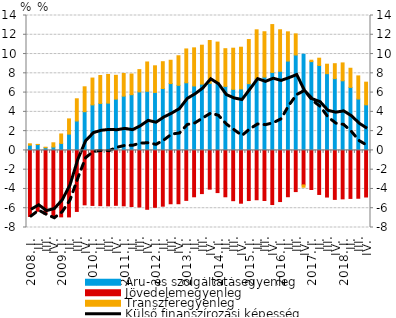
| Category | Áru- és szolgáltatásegyenleg | Jövedelemegyenleg | Transzferegyenleg |
|---|---|---|---|
| 2008. I. | 0.542 | -6.855 | 0.144 |
|          II. | 0.607 | -6.318 | 0.016 |
|          III. | 0.276 | -6.627 | 0.057 |
|          IV. | 0.356 | -6.874 | 0.434 |
| 2009. I. | 0.725 | -6.896 | 0.982 |
|          II. | 1.689 | -6.9 | 1.582 |
|          III. | 3.052 | -6.333 | 2.306 |
|          IV. | 4.018 | -5.649 | 2.584 |
| 2010. I. | 4.723 | -5.709 | 2.785 |
|          II. | 4.875 | -5.734 | 2.897 |
|          III. | 4.906 | -5.753 | 2.976 |
|          IV. | 5.323 | -5.696 | 2.468 |
| 2011. I. | 5.632 | -5.751 | 2.353 |
|          II. | 5.782 | -5.822 | 2.145 |
|          III. | 6.075 | -5.873 | 2.309 |
|          IV. | 6.133 | -6.11 | 3.044 |
| 2012. I. | 6.016 | -5.905 | 2.764 |
|          II. | 6.423 | -5.787 | 2.783 |
|          III. | 6.938 | -5.537 | 2.417 |
|          IV. | 6.753 | -5.533 | 3.069 |
| 2013. I. | 7.019 | -5.186 | 3.511 |
| II. | 6.687 | -4.813 | 3.957 |
|          III. | 6.877 | -4.481 | 4.041 |
| IV. | 6.964 | -4.021 | 4.439 |
| 2014. I. | 7.045 | -4.377 | 4.196 |
| II. | 6.644 | -4.812 | 3.912 |
|          III. | 6.341 | -5.217 | 4.266 |
| IV. | 6.378 | -5.478 | 4.33 |
| 2015. I. | 6.926 | -5.202 | 4.579 |
| II. | 7.419 | -5.119 | 5.096 |
|          III. | 7.611 | -5.199 | 4.703 |
| IV. | 8.097 | -5.618 | 4.963 |
| 2016. I. | 8.211 | -5.308 | 4.308 |
| II. | 9.27 | -4.808 | 3.036 |
|          III. | 9.902 | -4.273 | 2.193 |
| IV. | 9.98 | -3.582 | -0.238 |
| 2017. I. | 9.216 | -4.054 | 0.144 |
| II. | 8.816 | -4.57 | 0.754 |
|          III. | 7.963 | -4.839 | 0.982 |
| IV. | 7.449 | -5.084 | 1.549 |
| 2018. I. | 7.227 | -5.027 | 1.853 |
| II. | 6.54 | -4.982 | 1.986 |
|          III. | 5.33 | -4.964 | 2.403 |
| IV. | 4.734 | -4.835 | 2.347 |